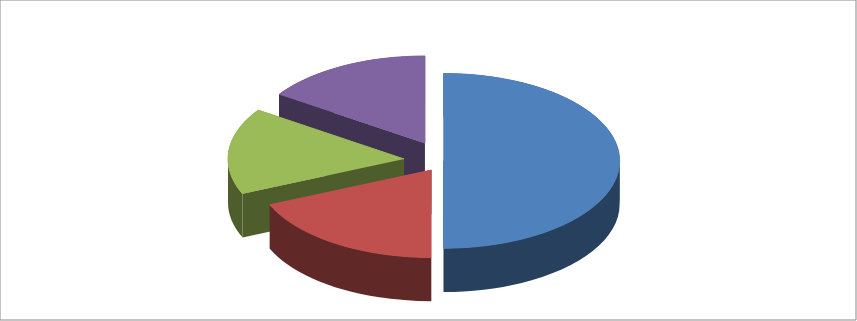
| Category | Series 0 |
|---|---|
| Taxa pe valoare adăugată (inclusiv restituirea) | 5250.6 |
| Impozite pe venit | 1941.1 |
| Accize (inclusiv restituirea) | 1676.9 |
| Alte venituri | 1632 |